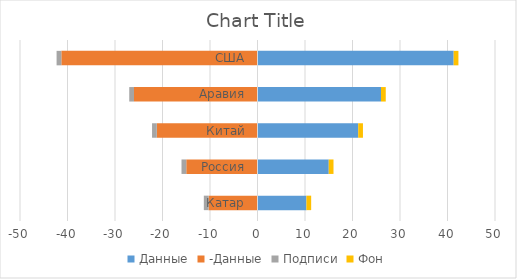
| Category | Данные | -Данные | Подписи | Фон |
|---|---|---|---|---|
| Катар | 10.3 | -10.3 | -1 | 1 |
| Россия | 15 | -15 | -1 | 1 |
| Китай | 21.2 | -21.2 | -1 | 1 |
| Аравия | 26 | -26 | -1 | 1 |
| США | 41.3 | -41.3 | -1 | 1 |